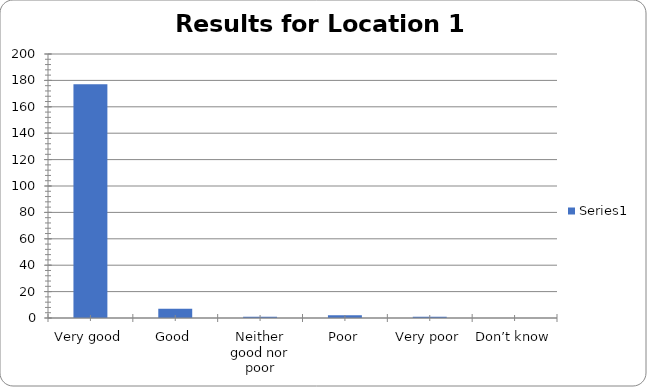
| Category | Series 0 |
|---|---|
| Very good | 177 |
| Good | 7 |
| Neither good nor poor | 1 |
| Poor | 2 |
| Very poor | 1 |
| Don’t know | 0 |